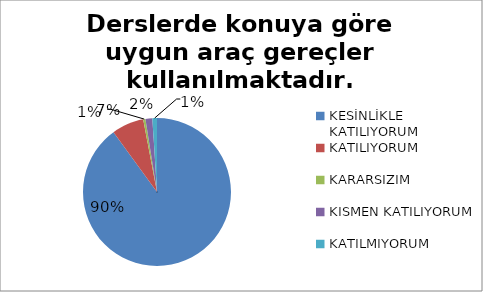
| Category | Derslerde konuya göre uygun araç gereçler kullanılmaktadır. |
|---|---|
| KESİNLİKLE KATILIYORUM | 180 |
| KATILIYORUM | 14 |
| KARARSIZIM | 1 |
| KISMEN KATILIYORUM | 3 |
| KATILMIYORUM | 2 |